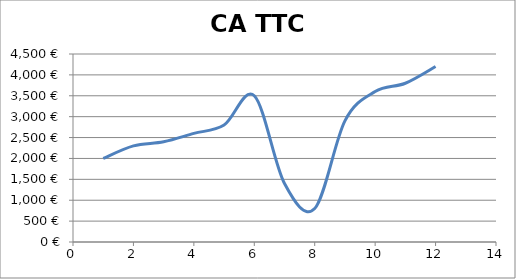
| Category | CA TTC |
|---|---|
| 0 | 2000 |
| 1 | 2300 |
| 2 | 2400 |
| 3 | 2600 |
| 4 | 2800 |
| 5 | 3500 |
| 6 | 1400 |
| 7 | 800 |
| 8 | 2900 |
| 9 | 3600 |
| 10 | 3800 |
| 11 | 4200 |